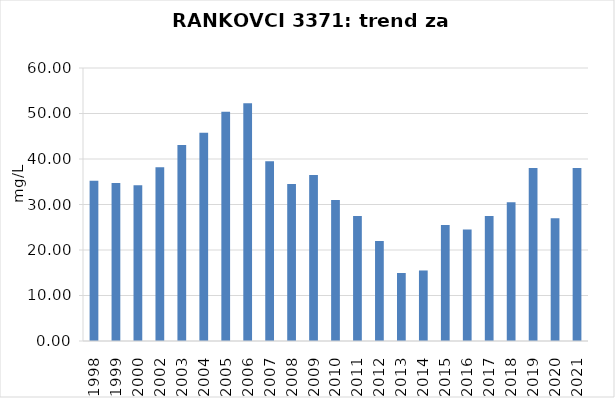
| Category | Vsota |
|---|---|
| 1998 | 35.2 |
| 1999 | 34.7 |
| 2000 | 34.25 |
| 2002 | 38.2 |
| 2003 | 43.075 |
| 2004 | 45.767 |
| 2005 | 50.367 |
| 2006 | 52.25 |
| 2007 | 39.5 |
| 2008 | 34.5 |
| 2009 | 36.5 |
| 2010 | 31 |
| 2011 | 27.5 |
| 2012 | 22 |
| 2013 | 14.95 |
| 2014 | 15.5 |
| 2015 | 25.5 |
| 2016 | 24.5 |
| 2017 | 27.5 |
| 2018 | 30.5 |
| 2019 | 38 |
| 2020 | 27 |
| 2021 | 38 |